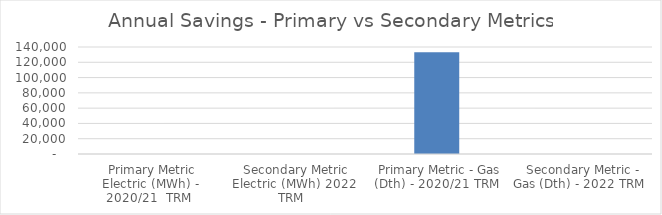
| Category | Series 0 |
|---|---|
|  Primary Metric Electric (MWh) - 2020/21  TRM  | 0 |
|  Secondary Metric Electric (MWh) 2022 TRM  | 0 |
|  Primary Metric - Gas (Dth) - 2020/21 TRM  | 133223.469 |
|  Secondary Metric - Gas (Dth) - 2022 TRM  | 0 |